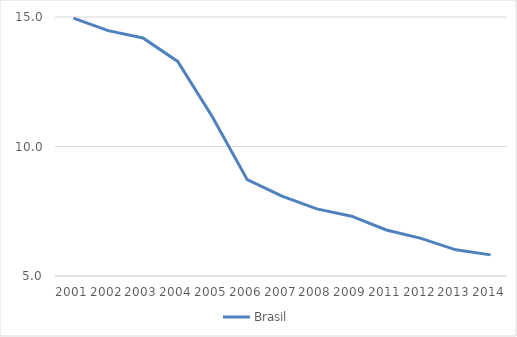
| Category | Brasil |
|---|---|
| 2001.0 | 14.955 |
| 2002.0 | 14.475 |
| 2003.0 | 14.19 |
| 2004.0 | 13.285 |
| 2005.0 | 11.14 |
| 2006.0 | 8.721 |
| 2007.0 | 8.08 |
| 2008.0 | 7.593 |
| 2009.0 | 7.309 |
| 2011.0 | 6.776 |
| 2012.0 | 6.452 |
| 2013.0 | 6.009 |
| 2014.0 | 5.816 |